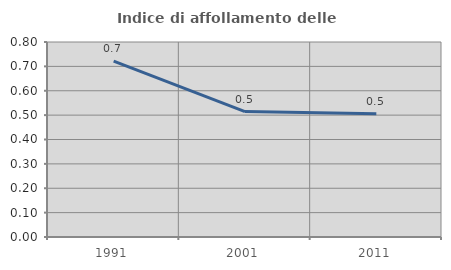
| Category | Indice di affollamento delle abitazioni  |
|---|---|
| 1991.0 | 0.722 |
| 2001.0 | 0.515 |
| 2011.0 | 0.505 |